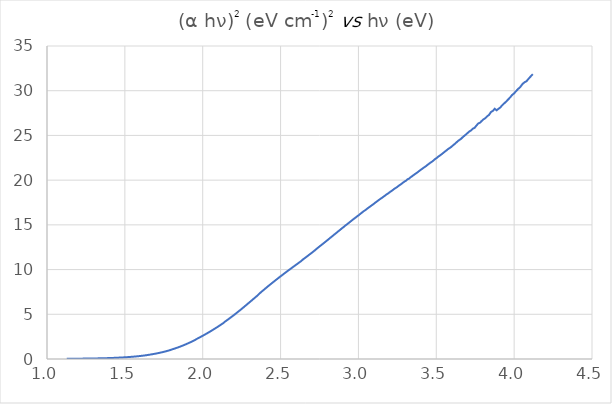
| Category | Series 0 |
|---|---|
| 1.12727 | 0.024 |
| 1.1283 | 0.024 |
| 1.12933 | 0.024 |
| 1.13036 | 0.025 |
| 1.13139 | 0.025 |
| 1.13242 | 0.025 |
| 1.13346 | 0.025 |
| 1.13449 | 0.025 |
| 1.13553 | 0.025 |
| 1.13657 | 0.025 |
| 1.13761 | 0.026 |
| 1.13866 | 0.026 |
| 1.13971 | 0.026 |
| 1.14075 | 0.026 |
| 1.1418 | 0.026 |
| 1.14286 | 0.026 |
| 1.14391 | 0.026 |
| 1.14497 | 0.027 |
| 1.14603 | 0.027 |
| 1.14709 | 0.027 |
| 1.14815 | 0.027 |
| 1.14921 | 0.027 |
| 1.15028 | 0.027 |
| 1.15135 | 0.028 |
| 1.15242 | 0.028 |
| 1.15349 | 0.028 |
| 1.15456 | 0.028 |
| 1.15564 | 0.028 |
| 1.15672 | 0.028 |
| 1.1578 | 0.029 |
| 1.15888 | 0.029 |
| 1.15996 | 0.029 |
| 1.16105 | 0.029 |
| 1.16214 | 0.029 |
| 1.16323 | 0.029 |
| 1.16432 | 0.03 |
| 1.16541 | 0.03 |
| 1.16651 | 0.03 |
| 1.16761 | 0.03 |
| 1.16871 | 0.03 |
| 1.16981 | 0.031 |
| 1.17092 | 0.031 |
| 1.17202 | 0.031 |
| 1.17313 | 0.031 |
| 1.17424 | 0.031 |
| 1.17536 | 0.032 |
| 1.17647 | 0.032 |
| 1.17759 | 0.032 |
| 1.17871 | 0.032 |
| 1.17983 | 0.032 |
| 1.18095 | 0.032 |
| 1.18208 | 0.033 |
| 1.18321 | 0.033 |
| 1.18434 | 0.033 |
| 1.18547 | 0.033 |
| 1.1866 | 0.033 |
| 1.18774 | 0.034 |
| 1.18888 | 0.034 |
| 1.19002 | 0.034 |
| 1.19116 | 0.034 |
| 1.19231 | 0.034 |
| 1.19346 | 0.035 |
| 1.19461 | 0.035 |
| 1.19576 | 0.035 |
| 1.19691 | 0.035 |
| 1.19807 | 0.036 |
| 1.19923 | 0.036 |
| 1.20039 | 0.036 |
| 1.20155 | 0.036 |
| 1.20272 | 0.036 |
| 1.20388 | 0.037 |
| 1.20505 | 0.037 |
| 1.20623 | 0.037 |
| 1.2074 | 0.037 |
| 1.20858 | 0.038 |
| 1.20976 | 0.038 |
| 1.21094 | 0.038 |
| 1.21212 | 0.038 |
| 1.21331 | 0.038 |
| 1.2145 | 0.039 |
| 1.21569 | 0.039 |
| 1.21688 | 0.039 |
| 1.21807 | 0.039 |
| 1.21927 | 0.04 |
| 1.22047 | 0.04 |
| 1.22167 | 0.04 |
| 1.22288 | 0.04 |
| 1.22409 | 0.041 |
| 1.2253 | 0.041 |
| 1.22651 | 0.041 |
| 1.22772 | 0.042 |
| 1.22894 | 0.042 |
| 1.23016 | 0.042 |
| 1.23138 | 0.042 |
| 1.2326 | 0.043 |
| 1.23383 | 0.043 |
| 1.23506 | 0.043 |
| 1.23629 | 0.043 |
| 1.23752 | 0.044 |
| 1.23876 | 0.044 |
| 1.24 | 0.044 |
| 1.24124 | 0.045 |
| 1.24248 | 0.045 |
| 1.24373 | 0.045 |
| 1.24498 | 0.045 |
| 1.24623 | 0.046 |
| 1.24748 | 0.046 |
| 1.24874 | 0.046 |
| 1.25 | 0.047 |
| 1.25126 | 0.047 |
| 1.25253 | 0.047 |
| 1.25379 | 0.048 |
| 1.25506 | 0.048 |
| 1.25633 | 0.048 |
| 1.25761 | 0.049 |
| 1.25888 | 0.049 |
| 1.26016 | 0.049 |
| 1.26144 | 0.049 |
| 1.26273 | 0.05 |
| 1.26402 | 0.05 |
| 1.26531 | 0.05 |
| 1.2666 | 0.051 |
| 1.26789 | 0.051 |
| 1.26919 | 0.051 |
| 1.27049 | 0.052 |
| 1.27179 | 0.052 |
| 1.2731 | 0.053 |
| 1.27441 | 0.053 |
| 1.27572 | 0.053 |
| 1.27703 | 0.054 |
| 1.27835 | 0.054 |
| 1.27967 | 0.054 |
| 1.28099 | 0.055 |
| 1.28232 | 0.055 |
| 1.28364 | 0.055 |
| 1.28497 | 0.056 |
| 1.28631 | 0.056 |
| 1.28764 | 0.057 |
| 1.28898 | 0.057 |
| 1.29032 | 0.057 |
| 1.29167 | 0.058 |
| 1.29301 | 0.058 |
| 1.29436 | 0.059 |
| 1.29572 | 0.059 |
| 1.29707 | 0.06 |
| 1.29843 | 0.06 |
| 1.29979 | 0.061 |
| 1.30115 | 0.061 |
| 1.30252 | 0.062 |
| 1.30389 | 0.062 |
| 1.30526 | 0.062 |
| 1.30664 | 0.063 |
| 1.30802 | 0.063 |
| 1.3094 | 0.064 |
| 1.31078 | 0.064 |
| 1.31217 | 0.065 |
| 1.31356 | 0.065 |
| 1.31495 | 0.066 |
| 1.31635 | 0.066 |
| 1.31775 | 0.067 |
| 1.31915 | 0.067 |
| 1.32055 | 0.068 |
| 1.32196 | 0.068 |
| 1.32337 | 0.069 |
| 1.32479 | 0.069 |
| 1.3262 | 0.07 |
| 1.32762 | 0.07 |
| 1.32905 | 0.071 |
| 1.33047 | 0.071 |
| 1.3319 | 0.072 |
| 1.33333 | 0.072 |
| 1.33477 | 0.073 |
| 1.33621 | 0.073 |
| 1.33765 | 0.074 |
| 1.33909 | 0.075 |
| 1.34054 | 0.075 |
| 1.34199 | 0.076 |
| 1.34345 | 0.076 |
| 1.3449 | 0.077 |
| 1.34636 | 0.077 |
| 1.34783 | 0.078 |
| 1.34929 | 0.079 |
| 1.35076 | 0.079 |
| 1.35224 | 0.08 |
| 1.35371 | 0.081 |
| 1.35519 | 0.081 |
| 1.35667 | 0.082 |
| 1.35816 | 0.083 |
| 1.35965 | 0.083 |
| 1.36114 | 0.084 |
| 1.36264 | 0.085 |
| 1.36414 | 0.085 |
| 1.36564 | 0.086 |
| 1.36714 | 0.087 |
| 1.36865 | 0.088 |
| 1.37017 | 0.088 |
| 1.37168 | 0.089 |
| 1.3732 | 0.09 |
| 1.37472 | 0.091 |
| 1.37625 | 0.091 |
| 1.37778 | 0.092 |
| 1.37931 | 0.094 |
| 1.38085 | 0.094 |
| 1.38239 | 0.095 |
| 1.38393 | 0.096 |
| 1.38547 | 0.097 |
| 1.38702 | 0.098 |
| 1.38858 | 0.099 |
| 1.39013 | 0.1 |
| 1.39169 | 0.1 |
| 1.39326 | 0.101 |
| 1.39483 | 0.102 |
| 1.3964 | 0.103 |
| 1.39797 | 0.104 |
| 1.39955 | 0.105 |
| 1.40113 | 0.106 |
| 1.40271 | 0.107 |
| 1.4043 | 0.108 |
| 1.4059 | 0.109 |
| 1.40749 | 0.11 |
| 1.40909 | 0.111 |
| 1.41069 | 0.112 |
| 1.4123 | 0.114 |
| 1.41391 | 0.115 |
| 1.41553 | 0.116 |
| 1.41714 | 0.117 |
| 1.41876 | 0.118 |
| 1.42039 | 0.119 |
| 1.42202 | 0.12 |
| 1.42365 | 0.122 |
| 1.42529 | 0.123 |
| 1.42693 | 0.124 |
| 1.42857 | 0.125 |
| 1.43022 | 0.126 |
| 1.43187 | 0.128 |
| 1.43353 | 0.129 |
| 1.43519 | 0.131 |
| 1.43685 | 0.132 |
| 1.43852 | 0.134 |
| 1.44019 | 0.135 |
| 1.44186 | 0.137 |
| 1.44354 | 0.138 |
| 1.44522 | 0.139 |
| 1.44691 | 0.141 |
| 1.4486 | 0.142 |
| 1.45029 | 0.144 |
| 1.45199 | 0.145 |
| 1.45369 | 0.147 |
| 1.4554 | 0.148 |
| 1.45711 | 0.15 |
| 1.45882 | 0.151 |
| 1.46054 | 0.153 |
| 1.46226 | 0.154 |
| 1.46399 | 0.156 |
| 1.46572 | 0.157 |
| 1.46746 | 0.159 |
| 1.46919 | 0.16 |
| 1.47094 | 0.162 |
| 1.47268 | 0.164 |
| 1.47444 | 0.165 |
| 1.47619 | 0.167 |
| 1.47795 | 0.169 |
| 1.47971 | 0.17 |
| 1.48148 | 0.172 |
| 1.48325 | 0.174 |
| 1.48503 | 0.175 |
| 1.48681 | 0.177 |
| 1.4886 | 0.179 |
| 1.49038 | 0.181 |
| 1.49218 | 0.183 |
| 1.49398 | 0.184 |
| 1.49578 | 0.186 |
| 1.49758 | 0.188 |
| 1.4994 | 0.19 |
| 1.50121 | 0.192 |
| 1.50303 | 0.194 |
| 1.50485 | 0.196 |
| 1.50668 | 0.198 |
| 1.50852 | 0.2 |
| 1.51035 | 0.202 |
| 1.5122 | 0.204 |
| 1.51404 | 0.206 |
| 1.51589 | 0.208 |
| 1.51775 | 0.21 |
| 1.51961 | 0.213 |
| 1.52147 | 0.215 |
| 1.52334 | 0.217 |
| 1.52522 | 0.219 |
| 1.52709 | 0.222 |
| 1.52898 | 0.224 |
| 1.53086 | 0.228 |
| 1.53276 | 0.231 |
| 1.53465 | 0.233 |
| 1.53656 | 0.236 |
| 1.53846 | 0.238 |
| 1.54037 | 0.241 |
| 1.54229 | 0.243 |
| 1.54421 | 0.246 |
| 1.54613 | 0.249 |
| 1.54806 | 0.251 |
| 1.55 | 0.254 |
| 1.55194 | 0.257 |
| 1.55388 | 0.26 |
| 1.55583 | 0.263 |
| 1.55779 | 0.266 |
| 1.55975 | 0.269 |
| 1.56171 | 0.272 |
| 1.56368 | 0.275 |
| 1.56566 | 0.278 |
| 1.56764 | 0.282 |
| 1.56962 | 0.285 |
| 1.57161 | 0.288 |
| 1.5736 | 0.291 |
| 1.5756 | 0.295 |
| 1.57761 | 0.298 |
| 1.57962 | 0.302 |
| 1.58163 | 0.305 |
| 1.58365 | 0.309 |
| 1.58568 | 0.312 |
| 1.58771 | 0.316 |
| 1.58974 | 0.32 |
| 1.59178 | 0.324 |
| 1.59383 | 0.328 |
| 1.59588 | 0.331 |
| 1.59794 | 0.335 |
| 1.6 | 0.34 |
| 1.60207 | 0.344 |
| 1.60414 | 0.348 |
| 1.60622 | 0.352 |
| 1.6083 | 0.357 |
| 1.61039 | 0.361 |
| 1.61248 | 0.365 |
| 1.61458 | 0.37 |
| 1.61669 | 0.374 |
| 1.6188 | 0.379 |
| 1.62092 | 0.384 |
| 1.62304 | 0.388 |
| 1.62516 | 0.393 |
| 1.6273 | 0.398 |
| 1.62943 | 0.403 |
| 1.63158 | 0.409 |
| 1.63373 | 0.413 |
| 1.63588 | 0.419 |
| 1.63804 | 0.424 |
| 1.64021 | 0.429 |
| 1.64238 | 0.438 |
| 1.64456 | 0.444 |
| 1.64675 | 0.45 |
| 1.64894 | 0.456 |
| 1.65113 | 0.461 |
| 1.65333 | 0.467 |
| 1.65554 | 0.473 |
| 1.65775 | 0.479 |
| 1.65997 | 0.486 |
| 1.6622 | 0.492 |
| 1.66443 | 0.498 |
| 1.66667 | 0.505 |
| 1.66891 | 0.511 |
| 1.67116 | 0.518 |
| 1.67341 | 0.525 |
| 1.67568 | 0.531 |
| 1.67794 | 0.538 |
| 1.68022 | 0.546 |
| 1.6825 | 0.553 |
| 1.68478 | 0.56 |
| 1.68707 | 0.567 |
| 1.68937 | 0.575 |
| 1.69168 | 0.582 |
| 1.69399 | 0.59 |
| 1.69631 | 0.597 |
| 1.69863 | 0.605 |
| 1.70096 | 0.613 |
| 1.7033 | 0.621 |
| 1.70564 | 0.629 |
| 1.70799 | 0.637 |
| 1.71034 | 0.646 |
| 1.71271 | 0.654 |
| 1.71508 | 0.663 |
| 1.71745 | 0.671 |
| 1.71983 | 0.68 |
| 1.72222 | 0.689 |
| 1.72462 | 0.698 |
| 1.72702 | 0.707 |
| 1.72943 | 0.717 |
| 1.73184 | 0.726 |
| 1.73427 | 0.736 |
| 1.73669 | 0.746 |
| 1.73913 | 0.756 |
| 1.74157 | 0.766 |
| 1.74402 | 0.776 |
| 1.74648 | 0.787 |
| 1.74894 | 0.798 |
| 1.75141 | 0.808 |
| 1.75389 | 0.819 |
| 1.75637 | 0.83 |
| 1.75887 | 0.842 |
| 1.76136 | 0.853 |
| 1.76387 | 0.864 |
| 1.76638 | 0.876 |
| 1.7689 | 0.887 |
| 1.77143 | 0.898 |
| 1.77396 | 0.912 |
| 1.7765 | 0.924 |
| 1.77905 | 0.937 |
| 1.78161 | 0.949 |
| 1.78417 | 0.962 |
| 1.78674 | 0.975 |
| 1.78932 | 0.988 |
| 1.79191 | 1.001 |
| 1.7945 | 1.015 |
| 1.7971 | 1.035 |
| 1.79971 | 1.053 |
| 1.80233 | 1.067 |
| 1.80495 | 1.082 |
| 1.80758 | 1.096 |
| 1.81022 | 1.111 |
| 1.81287 | 1.126 |
| 1.81552 | 1.142 |
| 1.81818 | 1.157 |
| 1.82085 | 1.172 |
| 1.82353 | 1.188 |
| 1.82622 | 1.204 |
| 1.82891 | 1.22 |
| 1.83161 | 1.236 |
| 1.83432 | 1.253 |
| 1.83704 | 1.27 |
| 1.83976 | 1.287 |
| 1.8425 | 1.304 |
| 1.84524 | 1.321 |
| 1.84799 | 1.339 |
| 1.85075 | 1.356 |
| 1.85351 | 1.375 |
| 1.85629 | 1.393 |
| 1.85907 | 1.412 |
| 1.86186 | 1.431 |
| 1.86466 | 1.45 |
| 1.86747 | 1.469 |
| 1.87029 | 1.489 |
| 1.87311 | 1.509 |
| 1.87595 | 1.53 |
| 1.87879 | 1.55 |
| 1.88164 | 1.571 |
| 1.8845 | 1.591 |
| 1.88737 | 1.613 |
| 1.89024 | 1.634 |
| 1.89313 | 1.656 |
| 1.89602 | 1.679 |
| 1.89893 | 1.7 |
| 1.90184 | 1.723 |
| 1.90476 | 1.746 |
| 1.90769 | 1.769 |
| 1.91063 | 1.791 |
| 1.91358 | 1.815 |
| 1.91654 | 1.838 |
| 1.9195 | 1.862 |
| 1.92248 | 1.886 |
| 1.92547 | 1.91 |
| 1.92846 | 1.935 |
| 1.93146 | 1.96 |
| 1.93448 | 1.985 |
| 1.9375 | 2.011 |
| 1.94053 | 2.037 |
| 1.94357 | 2.063 |
| 1.94662 | 2.089 |
| 1.94969 | 2.115 |
| 1.95276 | 2.142 |
| 1.95584 | 2.186 |
| 1.95893 | 2.217 |
| 1.96203 | 2.245 |
| 1.96513 | 2.274 |
| 1.96825 | 2.302 |
| 1.97138 | 2.331 |
| 1.97452 | 2.36 |
| 1.97767 | 2.389 |
| 1.98083 | 2.418 |
| 1.984 | 2.447 |
| 1.98718 | 2.477 |
| 1.99037 | 2.507 |
| 1.99357 | 2.538 |
| 1.99678 | 2.568 |
| 2.0 | 2.599 |
| 2.00323 | 2.63 |
| 2.00647 | 2.661 |
| 2.00972 | 2.692 |
| 2.01299 | 2.724 |
| 2.01626 | 2.756 |
| 2.01954 | 2.788 |
| 2.02284 | 2.821 |
| 2.02614 | 2.854 |
| 2.02946 | 2.887 |
| 2.03279 | 2.921 |
| 2.03612 | 2.955 |
| 2.03947 | 2.989 |
| 2.04283 | 3.023 |
| 2.0462 | 3.058 |
| 2.04959 | 3.094 |
| 2.05298 | 3.129 |
| 2.05638 | 3.165 |
| 2.0598 | 3.202 |
| 2.06323 | 3.238 |
| 2.06667 | 3.275 |
| 2.07012 | 3.313 |
| 2.07358 | 3.35 |
| 2.07705 | 3.388 |
| 2.08054 | 3.426 |
| 2.08403 | 3.463 |
| 2.08754 | 3.501 |
| 2.09106 | 3.54 |
| 2.09459 | 3.579 |
| 2.09814 | 3.619 |
| 2.10169 | 3.66 |
| 2.10526 | 3.7 |
| 2.10884 | 3.741 |
| 2.11244 | 3.782 |
| 2.11604 | 3.824 |
| 2.11966 | 3.866 |
| 2.12329 | 3.908 |
| 2.12693 | 3.952 |
| 2.13058 | 3.995 |
| 2.13425 | 4.038 |
| 2.13793 | 4.089 |
| 2.14162 | 4.159 |
| 2.14533 | 4.205 |
| 2.14905 | 4.251 |
| 2.15278 | 4.298 |
| 2.15652 | 4.345 |
| 2.16028 | 4.393 |
| 2.16405 | 4.44 |
| 2.16783 | 4.489 |
| 2.17163 | 4.536 |
| 2.17544 | 4.587 |
| 2.17926 | 4.636 |
| 2.1831 | 4.687 |
| 2.18695 | 4.738 |
| 2.19081 | 4.788 |
| 2.19469 | 4.841 |
| 2.19858 | 4.892 |
| 2.20249 | 4.943 |
| 2.20641 | 4.994 |
| 2.21034 | 5.048 |
| 2.21429 | 5.103 |
| 2.21825 | 5.156 |
| 2.22222 | 5.211 |
| 2.22621 | 5.267 |
| 2.23022 | 5.322 |
| 2.23423 | 5.379 |
| 2.23827 | 5.436 |
| 2.24231 | 5.494 |
| 2.24638 | 5.55 |
| 2.25045 | 5.609 |
| 2.25455 | 5.667 |
| 2.25865 | 5.727 |
| 2.26277 | 5.786 |
| 2.26691 | 5.847 |
| 2.27106 | 5.908 |
| 2.27523 | 5.97 |
| 2.27941 | 6.031 |
| 2.28361 | 6.093 |
| 2.28782 | 6.155 |
| 2.29205 | 6.218 |
| 2.2963 | 6.279 |
| 2.30056 | 6.341 |
| 2.30483 | 6.404 |
| 2.30912 | 6.467 |
| 2.31343 | 6.531 |
| 2.31776 | 6.594 |
| 2.3221 | 6.66 |
| 2.32645 | 6.724 |
| 2.33083 | 6.789 |
| 2.33522 | 6.855 |
| 2.33962 | 6.919 |
| 2.34405 | 6.983 |
| 2.34848 | 7.05 |
| 2.35294 | 7.116 |
| 2.35741 | 7.181 |
| 2.3619 | 7.27 |
| 2.36641 | 7.355 |
| 2.37094 | 7.421 |
| 2.37548 | 7.488 |
| 2.38004 | 7.555 |
| 2.38462 | 7.623 |
| 2.38921 | 7.69 |
| 2.39382 | 7.757 |
| 2.39845 | 7.825 |
| 2.4031 | 7.892 |
| 2.40777 | 7.959 |
| 2.41245 | 8.028 |
| 2.41715 | 8.096 |
| 2.42188 | 8.164 |
| 2.42661 | 8.233 |
| 2.43137 | 8.3 |
| 2.43615 | 8.367 |
| 2.44094 | 8.434 |
| 2.44576 | 8.501 |
| 2.45059 | 8.569 |
| 2.45545 | 8.637 |
| 2.46032 | 8.705 |
| 2.46521 | 8.773 |
| 2.47012 | 8.84 |
| 2.47505 | 8.907 |
| 2.48 | 8.974 |
| 2.48497 | 9.04 |
| 2.48996 | 9.11 |
| 2.49497 | 9.178 |
| 2.5 | 9.243 |
| 2.50505 | 9.312 |
| 2.51012 | 9.378 |
| 2.51521 | 9.447 |
| 2.52033 | 9.515 |
| 2.52546 | 9.583 |
| 2.53061 | 9.649 |
| 2.53579 | 9.718 |
| 2.54098 | 9.788 |
| 2.5462 | 9.854 |
| 2.55144 | 9.922 |
| 2.5567 | 9.988 |
| 2.56198 | 10.056 |
| 2.56729 | 10.126 |
| 2.57261 | 10.193 |
| 2.57796 | 10.264 |
| 2.58333 | 10.332 |
| 2.58873 | 10.4 |
| 2.59414 | 10.465 |
| 2.59958 | 10.535 |
| 2.60504 | 10.604 |
| 2.61053 | 10.674 |
| 2.61603 | 10.746 |
| 2.62156 | 10.816 |
| 2.62712 | 10.882 |
| 2.6327 | 10.953 |
| 2.6383 | 11.029 |
| 2.64392 | 11.135 |
| 2.64957 | 11.208 |
| 2.65525 | 11.28 |
| 2.66094 | 11.352 |
| 2.66667 | 11.429 |
| 2.67241 | 11.505 |
| 2.67819 | 11.583 |
| 2.68398 | 11.663 |
| 2.6898 | 11.74 |
| 2.69565 | 11.815 |
| 2.70153 | 11.891 |
| 2.70742 | 11.969 |
| 2.71335 | 12.056 |
| 2.7193 | 12.138 |
| 2.72527 | 12.225 |
| 2.73128 | 12.322 |
| 2.73731 | 12.405 |
| 2.74336 | 12.49 |
| 2.74945 | 12.573 |
| 2.75556 | 12.657 |
| 2.76169 | 12.741 |
| 2.76786 | 12.825 |
| 2.77405 | 12.914 |
| 2.78027 | 13 |
| 2.78652 | 13.085 |
| 2.79279 | 13.172 |
| 2.7991 | 13.264 |
| 2.80543 | 13.356 |
| 2.81179 | 13.442 |
| 2.81818 | 13.532 |
| 2.8246 | 13.629 |
| 2.83105 | 13.718 |
| 2.83753 | 13.808 |
| 2.84404 | 13.903 |
| 2.85057 | 13.994 |
| 2.85714 | 14.088 |
| 2.86374 | 14.179 |
| 2.87037 | 14.274 |
| 2.87703 | 14.365 |
| 2.88372 | 14.465 |
| 2.89044 | 14.558 |
| 2.8972 | 14.655 |
| 2.90398 | 14.745 |
| 2.9108 | 14.847 |
| 2.91765 | 14.944 |
| 2.92453 | 15.037 |
| 2.93144 | 15.125 |
| 2.93839 | 15.223 |
| 2.94537 | 15.32 |
| 2.95238 | 15.417 |
| 2.95943 | 15.517 |
| 2.96651 | 15.615 |
| 2.97362 | 15.708 |
| 2.98077 | 15.806 |
| 2.98795 | 15.901 |
| 2.99517 | 15.996 |
| 3.00242 | 16.087 |
| 3.00971 | 16.194 |
| 3.01703 | 16.296 |
| 3.02439 | 16.394 |
| 3.03178 | 16.503 |
| 3.03922 | 16.589 |
| 3.04668 | 16.675 |
| 3.05419 | 16.783 |
| 3.06173 | 16.882 |
| 3.06931 | 16.979 |
| 3.07692 | 17.07 |
| 3.08458 | 17.176 |
| 3.09227 | 17.267 |
| 3.1 | 17.367 |
| 3.10777 | 17.48 |
| 3.11558 | 17.578 |
| 3.12343 | 17.681 |
| 3.13131 | 17.783 |
| 3.13924 | 17.882 |
| 3.14721 | 17.979 |
| 3.15522 | 18.073 |
| 3.16327 | 18.18 |
| 3.17136 | 18.278 |
| 3.17949 | 18.391 |
| 3.18766 | 18.476 |
| 3.19588 | 18.582 |
| 3.20413 | 18.692 |
| 3.21244 | 18.792 |
| 3.22078 | 18.893 |
| 3.22917 | 19.011 |
| 3.2376 | 19.107 |
| 3.24607 | 19.198 |
| 3.25459 | 19.316 |
| 3.26316 | 19.427 |
| 3.27177 | 19.526 |
| 3.28042 | 19.642 |
| 3.28912 | 19.758 |
| 3.29787 | 19.864 |
| 3.30667 | 19.948 |
| 3.31551 | 20.102 |
| 3.3244 | 20.16 |
| 3.33333 | 20.302 |
| 3.34232 | 20.407 |
| 3.35135 | 20.529 |
| 3.36043 | 20.642 |
| 3.36957 | 20.756 |
| 3.37875 | 20.866 |
| 3.38798 | 20.998 |
| 3.39726 | 21.117 |
| 3.40659 | 21.229 |
| 3.41598 | 21.351 |
| 3.42541 | 21.47 |
| 3.4349 | 21.582 |
| 3.44444 | 21.717 |
| 3.45404 | 21.847 |
| 3.46369 | 21.966 |
| 3.47339 | 22.077 |
| 3.48315 | 22.215 |
| 3.49296 | 22.365 |
| 3.50282 | 22.476 |
| 3.51275 | 22.628 |
| 3.52273 | 22.749 |
| 3.53276 | 22.875 |
| 3.54286 | 23.019 |
| 3.55301 | 23.159 |
| 3.56322 | 23.297 |
| 3.57349 | 23.444 |
| 3.58382 | 23.568 |
| 3.5942 | 23.691 |
| 3.60465 | 23.85 |
| 3.61516 | 23.997 |
| 3.62573 | 24.161 |
| 3.63636 | 24.329 |
| 3.64706 | 24.477 |
| 3.65782 | 24.602 |
| 3.66864 | 24.786 |
| 3.67953 | 24.946 |
| 3.69048 | 25.108 |
| 3.70149 | 25.279 |
| 3.71257 | 25.448 |
| 3.72372 | 25.565 |
| 3.73494 | 25.757 |
| 3.74622 | 25.855 |
| 3.75758 | 26.097 |
| 3.769 | 26.332 |
| 3.78049 | 26.422 |
| 3.79205 | 26.624 |
| 3.80368 | 26.806 |
| 3.81538 | 26.93 |
| 3.82716 | 27.149 |
| 3.83901 | 27.296 |
| 3.85093 | 27.618 |
| 3.86293 | 27.734 |
| 3.875 | 27.982 |
| 3.88715 | 27.809 |
| 3.89937 | 27.974 |
| 3.91167 | 28.138 |
| 3.92405 | 28.39 |
| 3.93651 | 28.588 |
| 3.94904 | 28.793 |
| 3.96166 | 29.024 |
| 3.97436 | 29.251 |
| 3.98714 | 29.526 |
| 4.0 | 29.708 |
| 4.01294 | 29.964 |
| 4.02597 | 30.205 |
| 4.03909 | 30.407 |
| 4.05229 | 30.722 |
| 4.06557 | 30.932 |
| 4.07895 | 31.051 |
| 4.09241 | 31.33 |
| 4.10596 | 31.595 |
| 4.1196 | 31.847 |